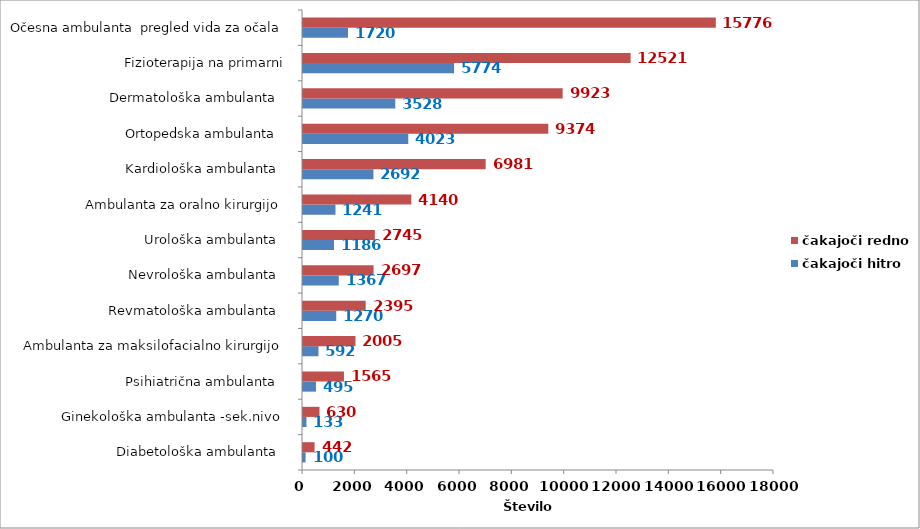
| Category | čakajoči hitro | čakajoči redno |
|---|---|---|
| Diabetološka ambulanta   | 100 | 442 |
| Ginekološka ambulanta -sek.nivo  | 133 | 630 |
| Psihiatrična ambulanta   | 495 | 1565 |
| Ambulanta za maksilofacialno kirurgijo  | 592 | 2005 |
| Revmatološka ambulanta   | 1270 | 2395 |
| Nevrološka ambulanta   | 1367 | 2697 |
| Urološka ambulanta   | 1186 | 2745 |
| Ambulanta za oralno kirurgijo  | 1241 | 4140 |
| Kardiološka ambulanta   | 2692 | 6981 |
| Ortopedska ambulanta   | 4023 | 9374 |
| Dermatološka ambulanta   | 3528 | 9923 |
| Fizioterapija na primarni | 5774 | 12521 |
| Očesna ambulanta  pregled vida za očala | 1720 | 15776 |